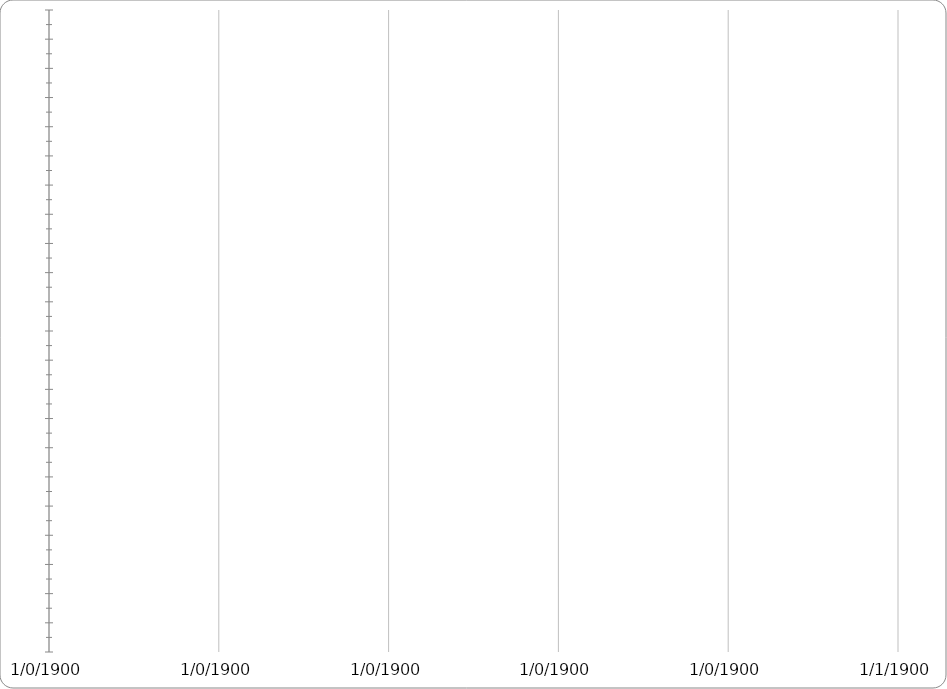
| Category | START | DURATION |
|---|---|---|
|  |  | 0 |
|  |  | 0 |
|  |  | 0 |
|  |  | 0 |
|  |  | 0 |
|  |  | 0 |
|  |  | 0 |
|  |  | 0 |
|  |  | 0 |
|  |  | 0 |
|  |  | 0 |
|  |  | 0 |
|  |  | 0 |
|  |  | 0 |
|  |  | 0 |
|  |  | 0 |
|  |  | 0 |
|  |  | 0 |
|  |  | 0 |
|  |  | 0 |
|  |  | 0 |
|  |  | 0 |